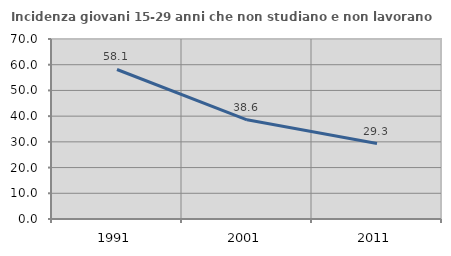
| Category | Incidenza giovani 15-29 anni che non studiano e non lavorano  |
|---|---|
| 1991.0 | 58.14 |
| 2001.0 | 38.571 |
| 2011.0 | 29.33 |